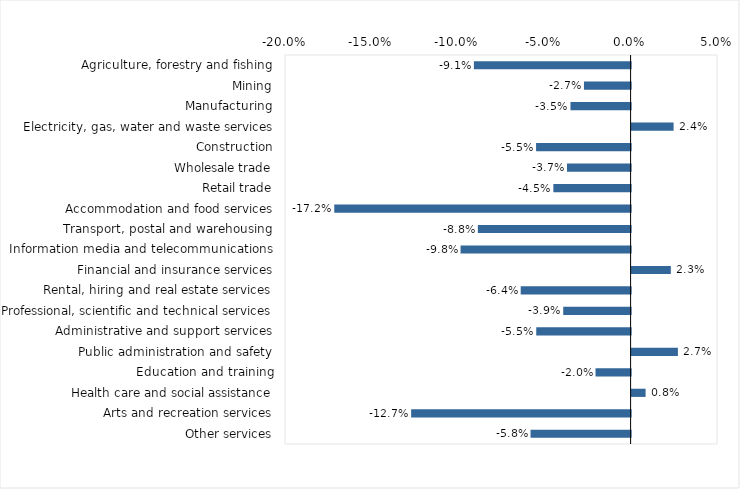
| Category | This week |
|---|---|
| Agriculture, forestry and fishing | -0.091 |
| Mining | -0.027 |
| Manufacturing | -0.035 |
| Electricity, gas, water and waste services | 0.024 |
| Construction | -0.055 |
| Wholesale trade | -0.037 |
| Retail trade | -0.045 |
| Accommodation and food services | -0.172 |
| Transport, postal and warehousing | -0.088 |
| Information media and telecommunications | -0.098 |
| Financial and insurance services | 0.023 |
| Rental, hiring and real estate services | -0.064 |
| Professional, scientific and technical services | -0.039 |
| Administrative and support services | -0.055 |
| Public administration and safety | 0.027 |
| Education and training | -0.02 |
| Health care and social assistance | 0.008 |
| Arts and recreation services | -0.127 |
| Other services | -0.058 |